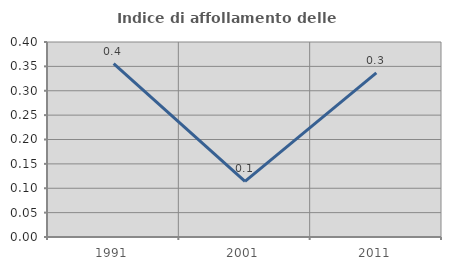
| Category | Indice di affollamento delle abitazioni  |
|---|---|
| 1991.0 | 0.356 |
| 2001.0 | 0.114 |
| 2011.0 | 0.337 |